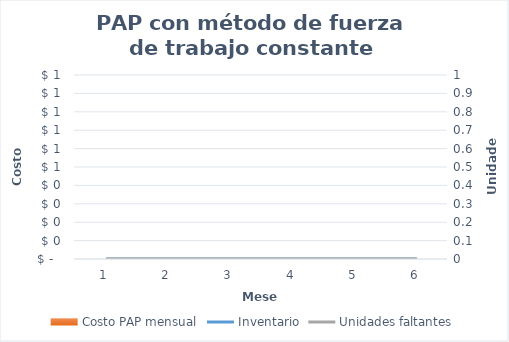
| Category | Costo PAP mensual |
|---|---|
| 0 | 0 |
| 1 | 0 |
| 2 | 0 |
| 3 | 0 |
| 4 | 0 |
| 5 | 0 |